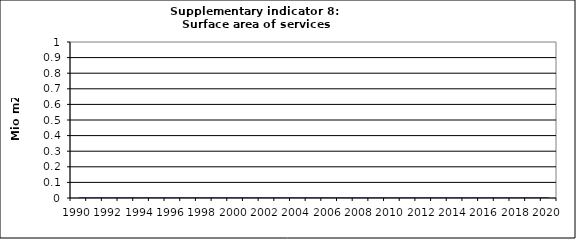
| Category | Surface area of services buildings, Mio m2 |
|---|---|
| 1990 | 0 |
| 1991 | 0 |
| 1992 | 0 |
| 1993 | 0 |
| 1994 | 0 |
| 1995 | 0 |
| 1996 | 0 |
| 1997 | 0 |
| 1998 | 0 |
| 1999 | 0 |
| 2000 | 0 |
| 2001 | 0 |
| 2002 | 0 |
| 2003 | 0 |
| 2004 | 0 |
| 2005 | 0 |
| 2006 | 0 |
| 2007 | 0 |
| 2008 | 0 |
| 2009 | 0 |
| 2010 | 0 |
| 2011 | 0 |
| 2012 | 0 |
| 2013 | 0 |
| 2014 | 0 |
| 2015 | 0 |
| 2016 | 0 |
| 2017 | 0 |
| 2018 | 0 |
| 2019 | 0 |
| 2020 | 0 |